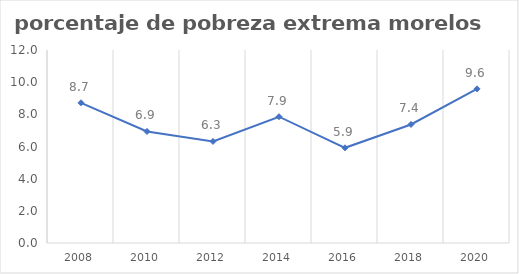
| Category | Series 0 |
|---|---|
| 2008.0 | 8.716 |
| 2010.0 | 6.934 |
| 2012.0 | 6.314 |
| 2014.0 | 7.852 |
| 2016.0 | 5.919 |
| 2018.0 | 7.37 |
| 2020.0 | 9.583 |